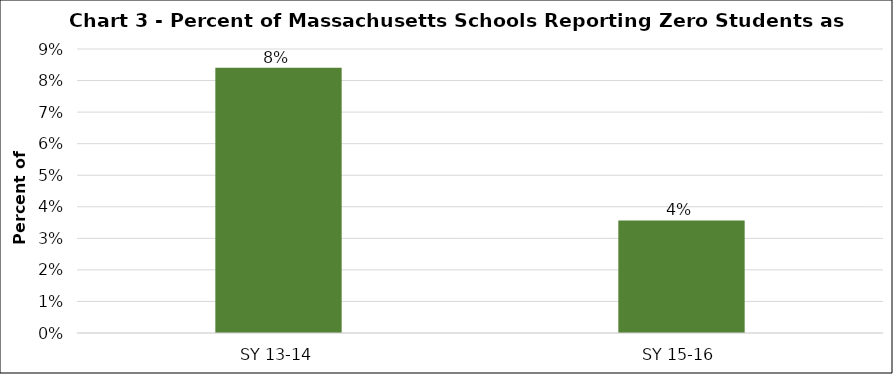
| Category | Series 0 |
|---|---|
| SY 13-14 | 0.084 |
| SY 15-16 | 0.036 |